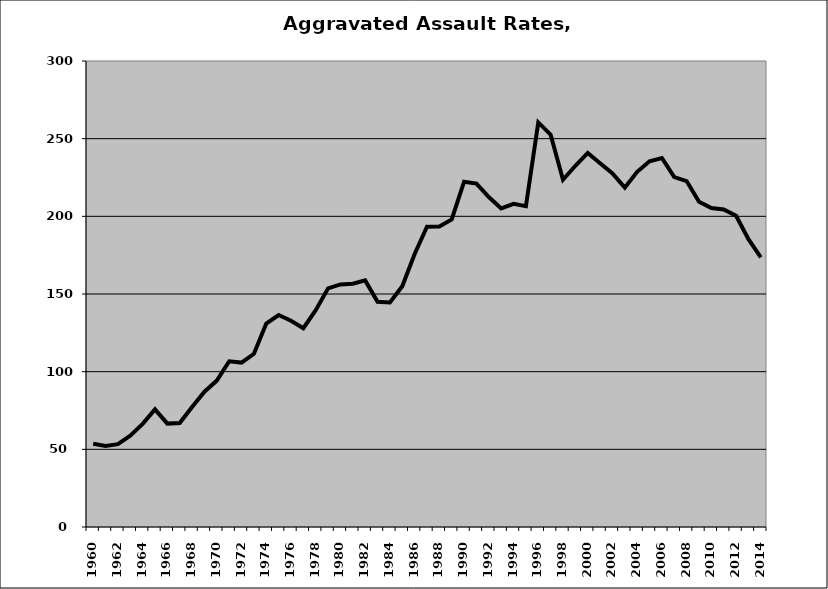
| Category | Aggravated Assault |
|---|---|
| 1960.0 | 53.643 |
| 1961.0 | 52.232 |
| 1962.0 | 53.314 |
| 1963.0 | 58.727 |
| 1964.0 | 66.376 |
| 1965.0 | 75.72 |
| 1966.0 | 66.56 |
| 1967.0 | 66.919 |
| 1968.0 | 77.28 |
| 1969.0 | 87.088 |
| 1970.0 | 94.244 |
| 1971.0 | 106.684 |
| 1972.0 | 105.836 |
| 1973.0 | 111.494 |
| 1974.0 | 130.959 |
| 1975.0 | 136.45 |
| 1976.0 | 132.794 |
| 1977.0 | 127.968 |
| 1978.0 | 139.549 |
| 1979.0 | 153.619 |
| 1980.0 | 156.137 |
| 1981.0 | 156.575 |
| 1982.0 | 158.744 |
| 1983.0 | 145.011 |
| 1984.0 | 144.492 |
| 1985.0 | 155.024 |
| 1986.0 | 175.801 |
| 1987.0 | 193.314 |
| 1988.0 | 193.523 |
| 1989.0 | 198.048 |
| 1990.0 | 222.309 |
| 1991.0 | 221.052 |
| 1992.0 | 212.382 |
| 1993.0 | 205.129 |
| 1994.0 | 208.024 |
| 1995.0 | 206.486 |
| 1996.0 | 260.46 |
| 1997.0 | 252.562 |
| 1998.0 | 223.54 |
| 1999.0 | 232.533 |
| 2000.0 | 240.859 |
| 2001.0 | 234.201 |
| 2002.0 | 227.597 |
| 2003.0 | 218.475 |
| 2004.0 | 228.642 |
| 2005.0 | 235.423 |
| 2006.0 | 237.536 |
| 2007.0 | 225.235 |
| 2008.0 | 222.69 |
| 2009.0 | 209.397 |
| 2010.0 | 205.316 |
| 2011.0 | 204.379 |
| 2012.0 | 200.329 |
| 2013.0 | 185.271 |
| 2014.0 | 173.525 |